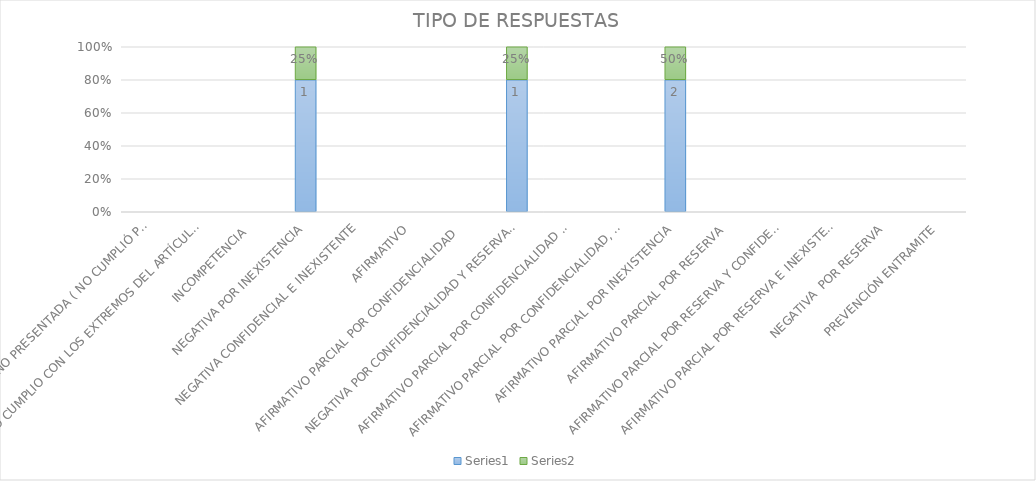
| Category | Series 4 | Series 5 |
|---|---|---|
| SE TIENE POR NO PRESENTADA ( NO CUMPLIÓ PREVENCIÓN) | 0 | 0 |
| NO CUMPLIO CON LOS EXTREMOS DEL ARTÍCULO 79 (REQUISITOS) | 0 | 0 |
| INCOMPETENCIA  | 0 | 0 |
| NEGATIVA POR INEXISTENCIA | 1 | 0.25 |
| NEGATIVA CONFIDENCIAL E INEXISTENTE | 0 | 0 |
| AFIRMATIVO | 0 | 0 |
| AFIRMATIVO PARCIAL POR CONFIDENCIALIDAD  | 0 | 0 |
| NEGATIVA POR CONFIDENCIALIDAD Y RESERVADA | 1 | 0.25 |
| AFIRMATIVO PARCIAL POR CONFIDENCIALIDAD E INEXISTENCIA | 0 | 0 |
| AFIRMATIVO PARCIAL POR CONFIDENCIALIDAD, RESERVA E INEXISTENCIA | 0 | 0 |
| AFIRMATIVO PARCIAL POR INEXISTENCIA | 2 | 0.5 |
| AFIRMATIVO PARCIAL POR RESERVA | 0 | 0 |
| AFIRMATIVO PARCIAL POR RESERVA Y CONFIDENCIALIDAD | 0 | 0 |
| AFIRMATIVO PARCIAL POR RESERVA E INEXISTENCIA | 0 | 0 |
| NEGATIVA  POR RESERVA | 0 | 0 |
| PREVENCIÓN ENTRAMITE | 0 | 0 |